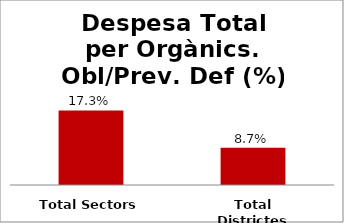
| Category | Series 0 |
|---|---|
| Total Sectors | 0.173 |
| Total Districtes | 0.087 |